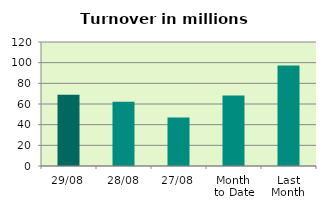
| Category | Series 0 |
|---|---|
| 29/08 | 69.025 |
| 28/08 | 62.198 |
| 27/08 | 47.02 |
| Month 
to Date | 68.169 |
| Last
Month | 97.283 |